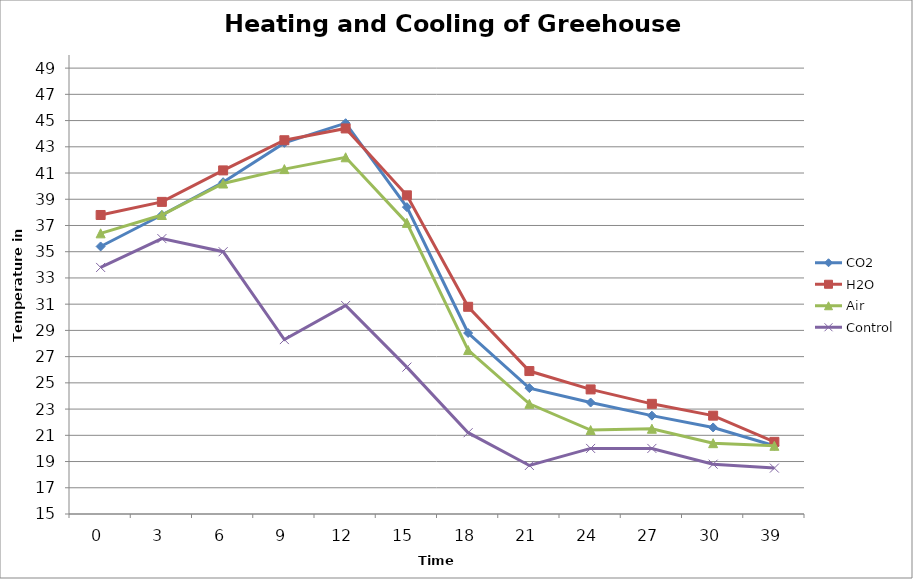
| Category | CO2 | H2O | Air | Control |
|---|---|---|---|---|
| 0.0 | 35.4 | 37.8 | 36.4 | 33.8 |
| 3.0 | 37.8 | 38.8 | 37.8 | 36 |
| 6.0 | 40.3 | 41.2 | 40.2 | 35 |
| 9.0 | 43.3 | 43.5 | 41.3 | 28.3 |
| 12.0 | 44.8 | 44.4 | 42.2 | 30.9 |
| 15.0 | 38.4 | 39.3 | 37.2 | 26.2 |
| 18.0 | 28.8 | 30.8 | 27.5 | 21.2 |
| 21.0 | 24.6 | 25.9 | 23.4 | 18.7 |
| 24.0 | 23.5 | 24.5 | 21.4 | 20 |
| 27.0 | 22.5 | 23.4 | 21.5 | 20 |
| 30.0 | 21.6 | 22.5 | 20.4 | 18.8 |
| 39.0 | 20.2 | 20.5 | 20.2 | 18.5 |